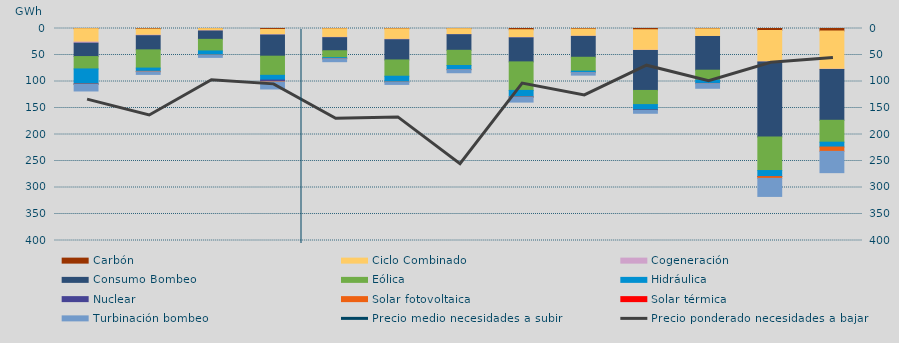
| Category | Carbón | Ciclo Combinado | Cogeneración | Consumo Bombeo | Eólica | Hidráulica | Nuclear | Solar fotovoltaica | Solar térmica | Turbinación bombeo |
|---|---|---|---|---|---|---|---|---|---|---|
| 0 | 301 | 25336.5 | 2018 | 25298.1 | 23328.3 | 28317.4 | 441 | 400.1 | 0 | 12441 |
| 1 | 986.1 | 11670.3 | 960.4 | 26699.8 | 34355.5 | 6189.5 | 0 | 824.2 | 0 | 4935.4 |
| 2 | 189.6 | 4322.2 | 260 | 15706.7 | 21872.4 | 7879.7 | 0 | 145 | 0 | 4127.7 |
| 3 | 1762.4 | 10092.7 | 511 | 39879.1 | 36105.2 | 8975.5 | 2589.8 | 902 | 0 | 13286.1 |
| 4 | 431.9 | 16303.5 | 603.6 | 24652 | 12996.3 | 2005.4 | 25 | 151.9 | 0 | 5443.1 |
| 5 | 587 | 19880.3 | 745.7 | 38129.4 | 30707.4 | 11038.8 | 0 | 83.9 | 0 | 4346.7 |
| 6 | 318.1 | 10959 | 432 | 29416 | 28648.7 | 7863.5 | 0 | 105 | 0 | 5723.9 |
| 7 | 2349.7 | 14809.8 | 513.2 | 45318.9 | 53811.9 | 12435.2 | 162.7 | 147 | 0 | 9302.2 |
| 8 | 1032.05 | 13586.525 | 372.15 | 39287.3 | 26177.05 | 2674.925 | 0 | 91.5 | 0 | 4779.4 |
| 9 | 2338.05 | 38734.9 | 425.275 | 75366.15 | 26713.775 | 10087.325 | 758.925 | 314.05 | 0 | 5208.05 |
| 10 | 607 | 14346.825 | 84.1 | 63631.75 | 18608.375 | 6324.8 | 376.5 | 124.625 | 0 | 8670.125 |
| 11 | 3747 | 59427.025 | 92.6 | 141431.55 | 63317 | 11208.6 | 225.6 | 3390.725 | 0 | 34005.35 |
| 12 | 4777.9 | 72027.575 | 369 | 96009.825 | 41297.175 | 9161.725 | 0 | 8173.5 | 0 | 40164.95 |